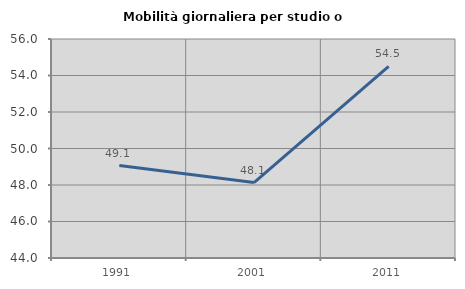
| Category | Mobilità giornaliera per studio o lavoro |
|---|---|
| 1991.0 | 49.068 |
| 2001.0 | 48.136 |
| 2011.0 | 54.495 |